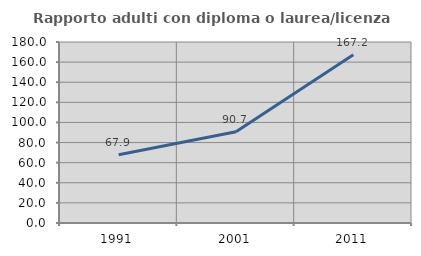
| Category | Rapporto adulti con diploma o laurea/licenza media  |
|---|---|
| 1991.0 | 67.895 |
| 2001.0 | 90.737 |
| 2011.0 | 167.216 |